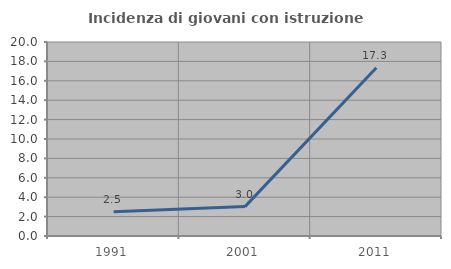
| Category | Incidenza di giovani con istruzione universitaria |
|---|---|
| 1991.0 | 2.5 |
| 2001.0 | 3.03 |
| 2011.0 | 17.347 |